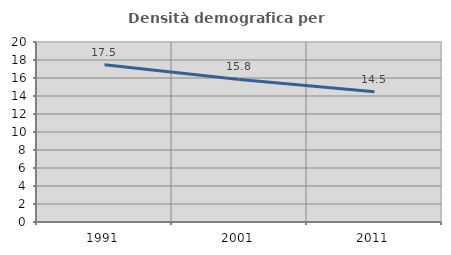
| Category | Densità demografica |
|---|---|
| 1991.0 | 17.464 |
| 2001.0 | 15.838 |
| 2011.0 | 14.464 |